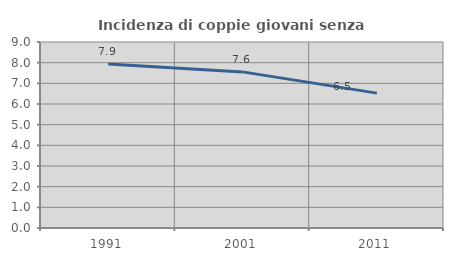
| Category | Incidenza di coppie giovani senza figli |
|---|---|
| 1991.0 | 7.935 |
| 2001.0 | 7.554 |
| 2011.0 | 6.526 |